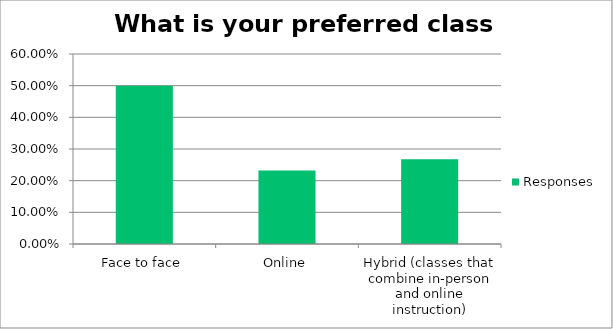
| Category | Responses |
|---|---|
| Face to face | 0.5 |
| Online | 0.232 |
| Hybrid (classes that combine in-person and online instruction) | 0.268 |